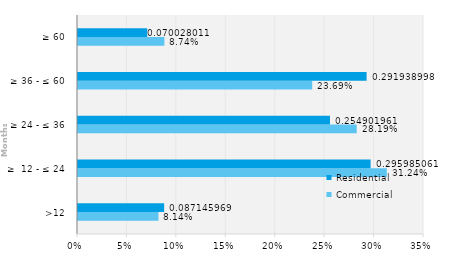
| Category | Commercial | Residential |
|---|---|---|
| >12 | 0.081 | 0.087 |
| ≥  12 - ≤ 24 | 0.312 | 0.296 |
| ≥ 24 - ≤ 36 | 0.282 | 0.255 |
| ≥ 36 - ≤ 60 | 0.237 | 0.292 |
| ≥ 60 | 0.087 | 0.07 |